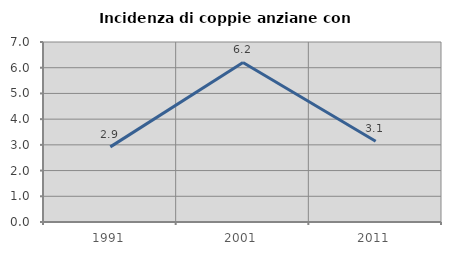
| Category | Incidenza di coppie anziane con figli |
|---|---|
| 1991.0 | 2.922 |
| 2001.0 | 6.204 |
| 2011.0 | 3.139 |